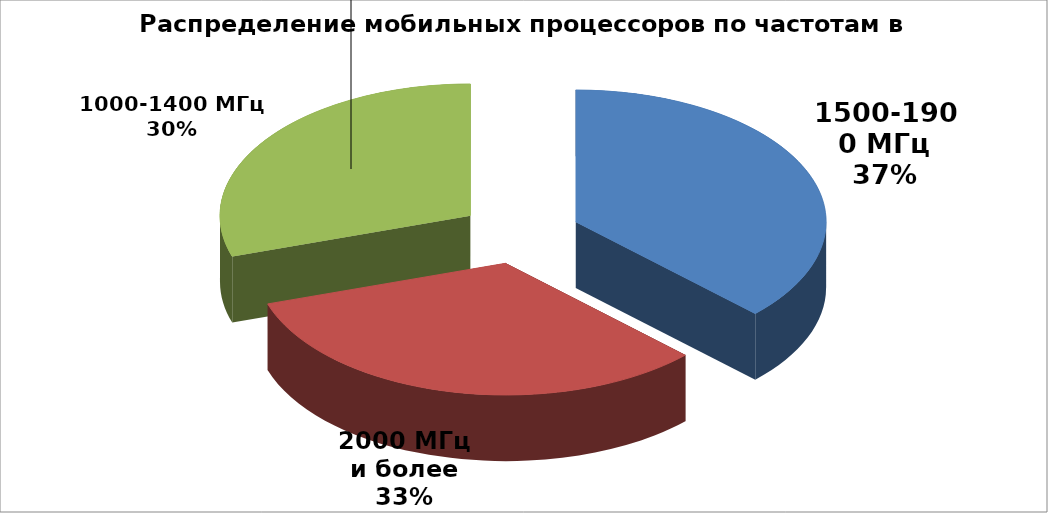
| Category | Series 0 |
|---|---|
| 1500-1900 МГц | 41 |
| 2000 МГц и более | 36 |
| 1000-1400 МГц | 33 |